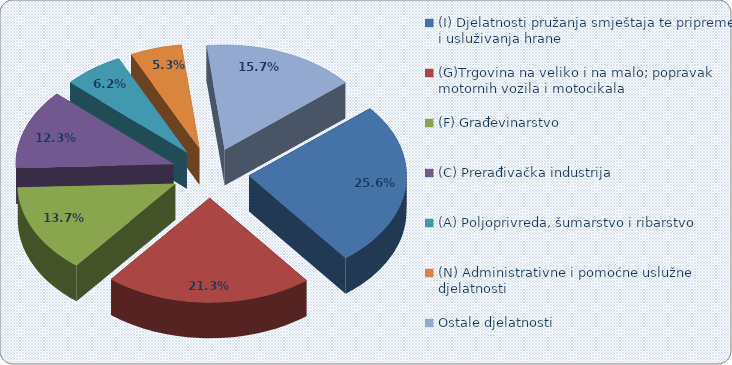
| Category | Ukupan prihod 2017 |
|---|---|
| (I) Djelatnosti pružanja smještaja te pripreme i usluživanja hrane  | 2690194.562 |
| (G)Trgovina na veliko i na malo; popravak motornih vozila i motocikala | 2235772.762 |
| (F) Građevinarstvo | 1434603.638 |
| (C) Prerađivačka industrija | 1291414.72 |
| (A) Poljoprivreda, šumarstvo i ribarstvo | 646264.102 |
| (N) Administrativne i pomoćne uslužne djelatnosti | 556706.017 |
| Ostale djelatnosti | 1651428.069 |